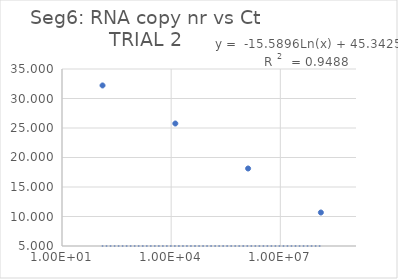
| Category | Series 0 |
|---|---|
| 130000000.0 | 10.677 |
| 1300000.0 | 18.137 |
| 13000.0 | 25.76 |
| 130.0 | 32.212 |